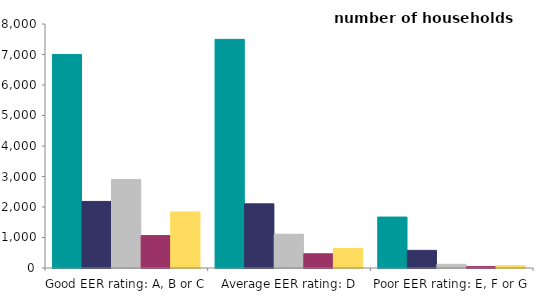
| Category | owner occupied | private rented | social rented | local authority | housing association |
|---|---|---|---|---|---|
| Good EER rating: A, B or C | 7001.328 | 2182.43 | 2900.28 | 1062.005 | 1838.275 |
| Average EER rating: D | 7496.144 | 2103.534 | 1106.29 | 465.855 | 640.435 |
| Poor EER rating: E, F or G | 1670.41 | 578.371 | 121.601 | 46.243 | 75.358 |